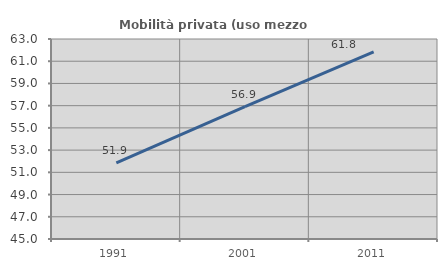
| Category | Mobilità privata (uso mezzo privato) |
|---|---|
| 1991.0 | 51.852 |
| 2001.0 | 56.917 |
| 2011.0 | 61.845 |